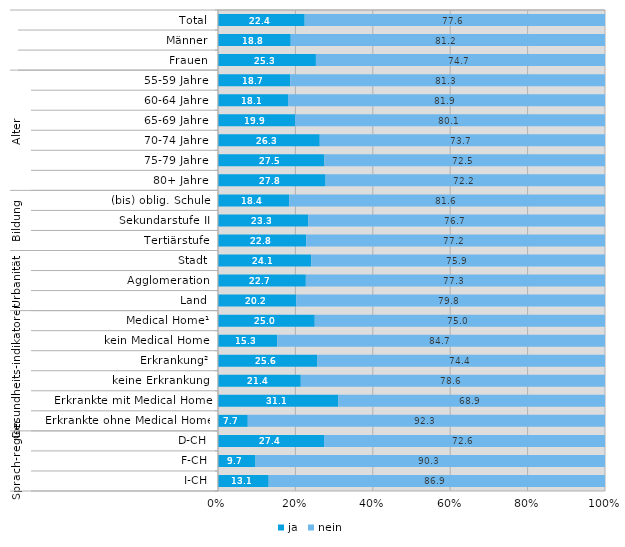
| Category | ja | nein |
|---|---|---|
| 0 | 22.4 | 77.6 |
| 1 | 18.8 | 81.2 |
| 2 | 25.3 | 74.7 |
| 3 | 18.7 | 81.3 |
| 4 | 18.1 | 81.9 |
| 5 | 19.9 | 80.1 |
| 6 | 26.3 | 73.7 |
| 7 | 27.5 | 72.5 |
| 8 | 27.8 | 72.2 |
| 9 | 18.4 | 81.6 |
| 10 | 23.3 | 76.7 |
| 11 | 22.8 | 77.2 |
| 12 | 24.1 | 75.9 |
| 13 | 22.7 | 77.3 |
| 14 | 20.2 | 79.8 |
| 15 | 25 | 75 |
| 16 | 15.3 | 84.7 |
| 17 | 25.6 | 74.4 |
| 18 | 21.4 | 78.6 |
| 19 | 31.1 | 68.9 |
| 20 | 7.7 | 92.3 |
| 21 | 27.4 | 72.6 |
| 22 | 9.7 | 90.3 |
| 23 | 13.1 | 86.9 |